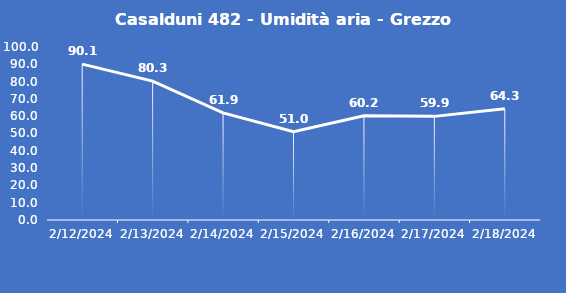
| Category | Casalduni 482 - Umidità aria - Grezzo (%) |
|---|---|
| 2/12/24 | 90.1 |
| 2/13/24 | 80.3 |
| 2/14/24 | 61.9 |
| 2/15/24 | 51 |
| 2/16/24 | 60.2 |
| 2/17/24 | 59.9 |
| 2/18/24 | 64.3 |